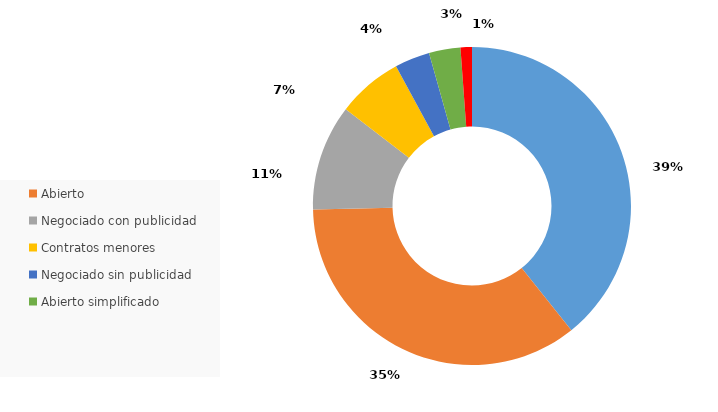
| Category | Series 0 |
|---|---|
| Encargos | 1142011.3 |
| Abierto | 1029162.47 |
| Negociado con publicidad | 313000 |
| Contratos menores | 193959.97 |
| Negociado sin publicidad | 103954.88 |
| Abierto simplificado | 93000 |
| Contratación centralizada | 33713.95 |